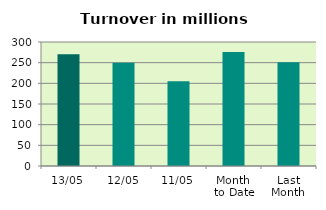
| Category | Series 0 |
|---|---|
| 13/05 | 270.43 |
| 12/05 | 249.849 |
| 11/05 | 205.269 |
| Month 
to Date | 275.889 |
| Last
Month | 250.745 |